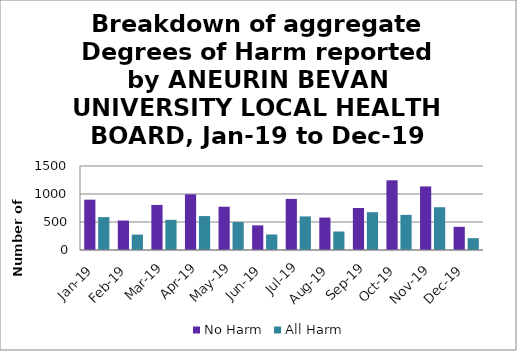
| Category | No Harm | All Harm |
|---|---|---|
| Jan-19 | 899 | 587 |
| Feb-19 | 526 | 275 |
| Mar-19 | 805 | 539 |
| Apr-19 | 994 | 606 |
| May-19 | 773 | 499 |
| Jun-19 | 440 | 277 |
| Jul-19 | 912 | 600 |
| Aug-19 | 579 | 330 |
| Sep-19 | 750 | 675 |
| Oct-19 | 1245 | 627 |
| Nov-19 | 1135 | 764 |
| Dec-19 | 414 | 211 |